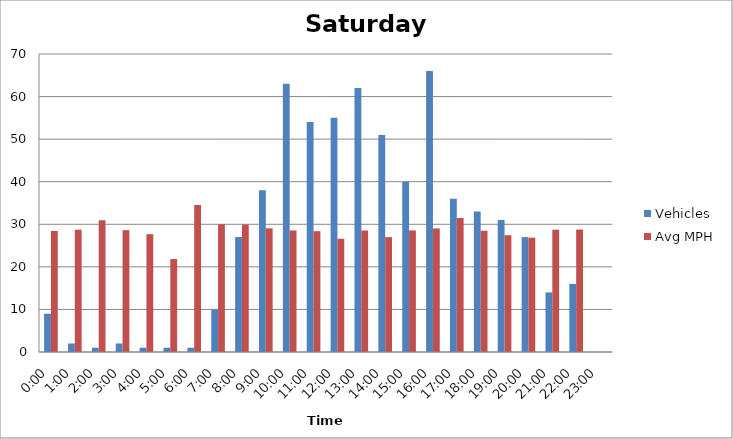
| Category | Vehicles | Avg MPH |
|---|---|---|
| 0:00 | 9 | 28.42 |
| 1:00 | 2 | 28.74 |
| 2:00 | 1 | 30.96 |
| 3:00 | 2 | 28.62 |
| 4:00 | 1 | 27.67 |
| 5:00 | 1 | 21.83 |
| 6:00 | 1 | 34.53 |
| 7:00 | 10 | 30.02 |
| 8:00 | 27 | 29.96 |
| 9:00 | 38 | 29.05 |
| 10:00 | 63 | 28.56 |
| 11:00 | 54 | 28.38 |
| 12:00 | 55 | 26.6 |
| 13:00 | 62 | 28.53 |
| 14:00 | 51 | 26.98 |
| 15:00 | 40 | 28.56 |
| 16:00 | 66 | 29.03 |
| 17:00 | 36 | 31.5 |
| 18:00 | 33 | 28.49 |
| 19:00 | 31 | 27.43 |
| 20:00 | 27 | 26.86 |
| 21:00 | 14 | 28.73 |
| 22:00 | 16 | 28.77 |
| 23:00 | 0 | 0 |